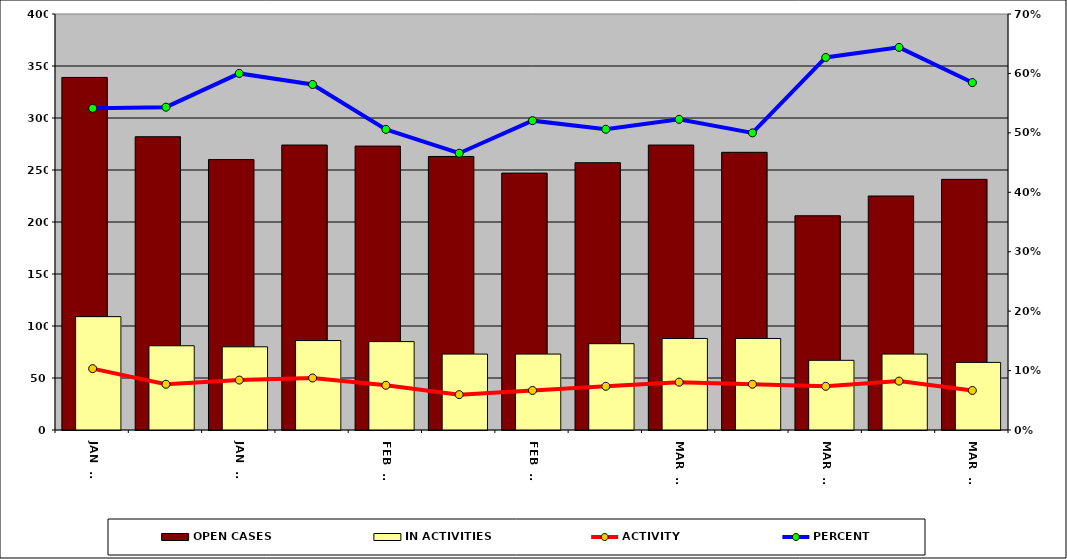
| Category | OPEN CASES | IN ACTIVITIES |
|---|---|---|
| FEB 27 | 339 | 109 |
| MAR 06 | 282 | 81 |
| MAR 13 | 260 | 80 |
| MAR 20 | 274 | 86 |
| MAR 27 | 273 | 85 |
| APR 03 | 263 | 73 |
| APR 10 | 247 | 73 |
| APR 17 | 257 | 83 |
| APR 24 | 274 | 88 |
| MAY 01 | 267 | 88 |
| MAY 08 | 206 | 67 |
| MAY 15 | 225 | 73 |
| MAY 22 | 241 | 65 |